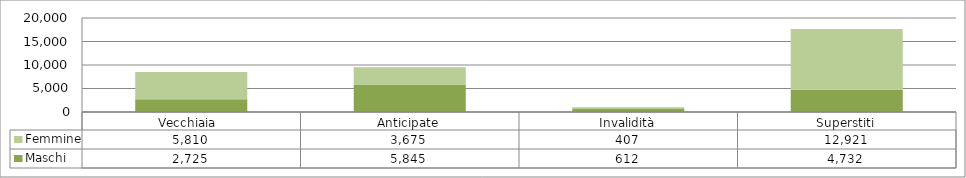
| Category | Maschi | Femmine |
|---|---|---|
| Vecchiaia  | 2725 | 5810 |
| Anticipate | 5845 | 3675 |
| Invalidità | 612 | 407 |
| Superstiti | 4732 | 12921 |